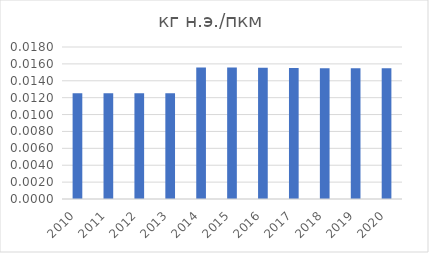
| Category | кг н.э./пкм |
|---|---|
| 2010.0 | 0.013 |
| 2011.0 | 0.013 |
| 2012.0 | 0.013 |
| 2013.0 | 0.013 |
| 2014.0 | 0.016 |
| 2015.0 | 0.016 |
| 2016.0 | 0.016 |
| 2017.0 | 0.016 |
| 2018.0 | 0.015 |
| 2019.0 | 0.015 |
| 2020.0 | 0.015 |